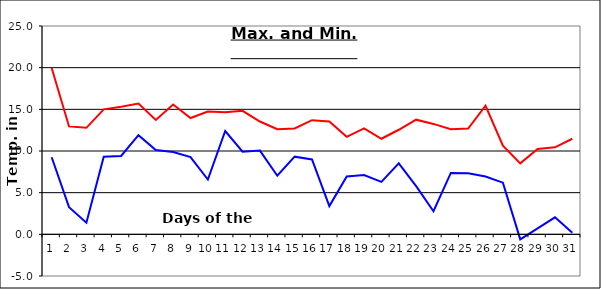
| Category | Series 0 | Series 1 |
|---|---|---|
| 0 | 19.96 | 9.25 |
| 1 | 12.95 | 3.26 |
| 2 | 12.78 | 1.4 |
| 3 | 15 | 9.3 |
| 4 | 15.3 | 9.4 |
| 5 | 15.69 | 11.9 |
| 6 | 13.73 | 10.11 |
| 7 | 15.57 | 9.87 |
| 8 | 13.96 | 9.27 |
| 9 | 14.74 | 6.58 |
| 10 | 14.66 | 12.4 |
| 11 | 14.82 | 9.91 |
| 12 | 13.54 | 10.05 |
| 13 | 12.61 | 7.03 |
| 14 | 12.71 | 9.32 |
| 15 | 13.7 | 8.98 |
| 16 | 13.54 | 3.39 |
| 17 | 11.7 | 6.95 |
| 18 | 12.71 | 7.11 |
| 19 | 11.47 | 6.29 |
| 20 | 12.55 | 8.51 |
| 21 | 13.76 | 5.78 |
| 22 | 13.25 | 2.77 |
| 23 | 12.61 | 7.37 |
| 24 | 12.7 | 7.34 |
| 25 | 15.43 | 6.93 |
| 26 | 10.65 | 6.2 |
| 27 | 8.52 | -0.6 |
| 28 | 10.23 | 0.72 |
| 29 | 10.44 | 2.04 |
| 30 | 11.47 | 0.18 |